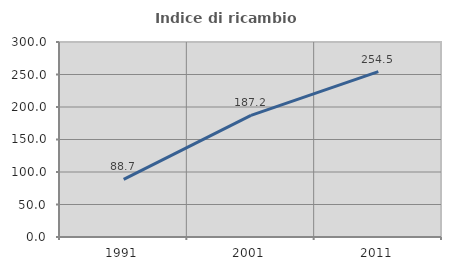
| Category | Indice di ricambio occupazionale  |
|---|---|
| 1991.0 | 88.662 |
| 2001.0 | 187.209 |
| 2011.0 | 254.486 |